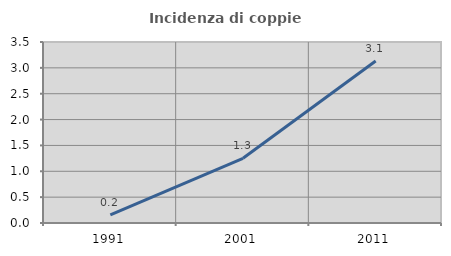
| Category | Incidenza di coppie miste |
|---|---|
| 1991.0 | 0.156 |
| 2001.0 | 1.252 |
| 2011.0 | 3.133 |